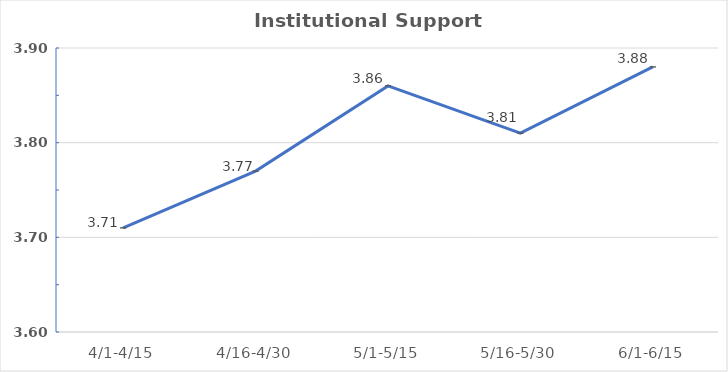
| Category | Series 0 |
|---|---|
| 4/1-4/15 | 3.71 |
| 4/16-4/30 | 3.77 |
| 5/1-5/15 | 3.86 |
| 5/16-5/30 | 3.81 |
| 6/1-6/15 | 3.88 |